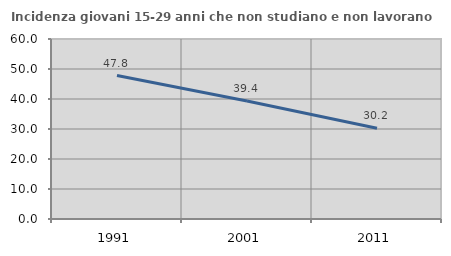
| Category | Incidenza giovani 15-29 anni che non studiano e non lavorano  |
|---|---|
| 1991.0 | 47.817 |
| 2001.0 | 39.354 |
| 2011.0 | 30.247 |